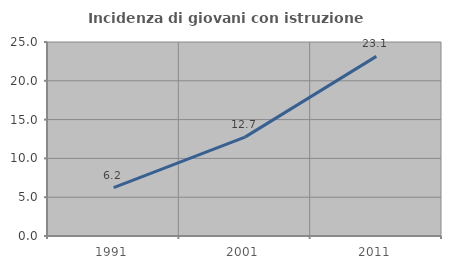
| Category | Incidenza di giovani con istruzione universitaria |
|---|---|
| 1991.0 | 6.221 |
| 2001.0 | 12.741 |
| 2011.0 | 23.144 |